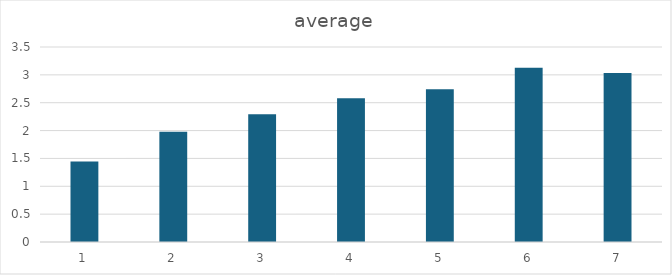
| Category | average |
|---|---|
| 0 | 1.446 |
| 1 | 1.978 |
| 2 | 2.293 |
| 3 | 2.578 |
| 4 | 2.741 |
| 5 | 3.129 |
| 6 | 3.035 |